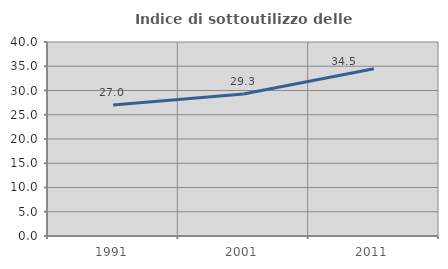
| Category | Indice di sottoutilizzo delle abitazioni  |
|---|---|
| 1991.0 | 27.011 |
| 2001.0 | 29.261 |
| 2011.0 | 34.472 |